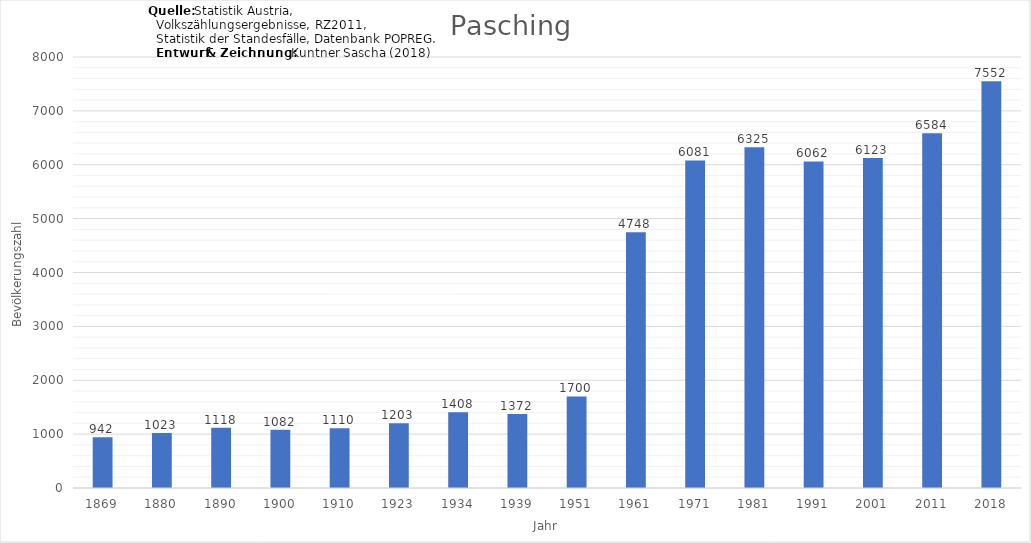
| Category | Bevölkerungszahl |
|---|---|
| 1869.0 | 942 |
| 1880.0 | 1023 |
| 1890.0 | 1118 |
| 1900.0 | 1082 |
| 1910.0 | 1110 |
| 1923.0 | 1203 |
| 1934.0 | 1408 |
| 1939.0 | 1372 |
| 1951.0 | 1700 |
| 1961.0 | 4748 |
| 1971.0 | 6081 |
| 1981.0 | 6325 |
| 1991.0 | 6062 |
| 2001.0 | 6123 |
| 2011.0 | 6584 |
| 2018.0 | 7552 |